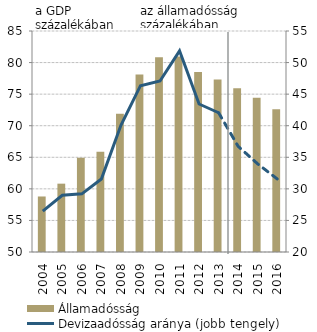
| Category | Államadósság |
|---|---|
| 2004.0 | 58.792 |
| 2005.0 | 60.823 |
| 2006.0 | 64.928 |
| 2007.0 | 65.858 |
| 2008.0 | 71.891 |
| 2009.0 | 78.127 |
| 2010.0 | 80.838 |
| 2011.0 | 80.963 |
| 2012.0 | 78.492 |
| 2013.0 | 77.336 |
| 2014.0 | 75.942 |
| 2015.0 | 74.419 |
| 2016.0 | 72.601 |